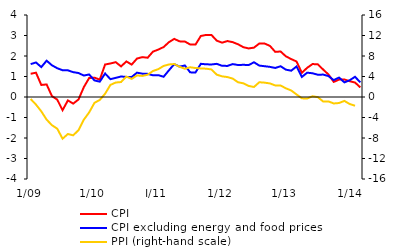
| Category | CPI | CPI excluding energy and food prices |
|---|---|---|
| 1/09 | 1.134 | 1.604 |
| 2 | 1.186 | 1.684 |
| 3 | 0.587 | 1.459 |
| 4 | 0.613 | 1.77 |
| 5 | 0.046 | 1.548 |
| 6 | -0.129 | 1.404 |
| 7 | -0.645 | 1.306 |
| 8 | -0.166 | 1.301 |
| 9 | -0.322 | 1.212 |
| 10 | -0.12 | 1.17 |
| 11 | 0.481 | 1.047 |
| 12 | 0.926 | 1.098 |
| 1/10 | 0.944 | 0.809 |
| 2 | 0.847 | 0.748 |
| 3 | 1.585 | 1.147 |
| 4 | 1.635 | 0.87 |
| 5 | 1.699 | 0.935 |
| 6 | 1.493 | 1.001 |
| 7 | 1.734 | 0.978 |
| 8 | 1.581 | 0.975 |
| 9 | 1.876 | 1.188 |
| 10 | 1.945 | 1.137 |
| 11 | 1.915 | 1.129 |
| 12 | 2.212 | 1.059 |
| I/11 | 2.314 | 1.066 |
| 2 | 2.436 | 0.987 |
| 3 | 2.674 | 1.301 |
| 4 | 2.836 | 1.604 |
| 5 | 2.714 | 1.482 |
| 6 | 2.705 | 1.537 |
| 7 | 2.562 | 1.202 |
| 8 | 2.557 | 1.198 |
| 9 | 2.975 | 1.618 |
| 10 | 3.029 | 1.595 |
| 11 | 3.027 | 1.587 |
| 12 | 2.748 | 1.617 |
| 1/12 | 2.65 | 1.522 |
| 2 | 2.729 | 1.517 |
| 3 | 2.675 | 1.605 |
| 4 | 2.572 | 1.561 |
| 5 | 2.43 | 1.57 |
| 6 | 2.369 | 1.56 |
| 7 | 2.409 | 1.694 |
| 8 | 2.608 | 1.532 |
| 9 | 2.607 | 1.501 |
| 10 | 2.493 | 1.47 |
| 11 | 2.201 | 1.417 |
| 12 | 2.22 | 1.501 |
| 1/13 | 1.983 | 1.334 |
| 2 | 1.85 | 1.283 |
| 3 | 1.731 | 1.49 |
| 4 | 1.18 | 0.979 |
| 5 | 1.424 | 1.186 |
| 6 | 1.606 | 1.158 |
| 7 | 1.597 | 1.086 |
| 8 | 1.34 | 1.093 |
| 9 | 1.099 | 1.022 |
| 10 | 0.736 | 0.823 |
| 11 | 0.849 | 0.949 |
| 12 | 0.855 | 0.713 |
|  1/14 | 0.769 | 0.817 |
| 2 | 0.706 | 0.986 |
| 3 | 0.468 | 0.712 |